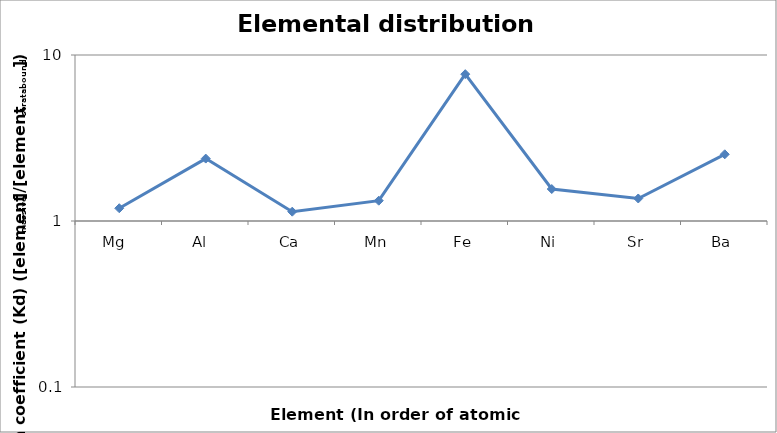
| Category | Series 0 |
|---|---|
| Mg  | 1.194 |
| Al  | 2.377 |
| Ca | 1.138 |
| Mn | 1.325 |
| Fe | 7.664 |
| Ni | 1.558 |
| Sr | 1.366 |
| Ba | 2.523 |